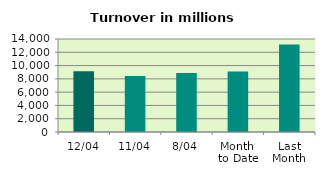
| Category | Series 0 |
|---|---|
| 12/04 | 9132.205 |
| 11/04 | 8417.893 |
| 8/04 | 8900.512 |
| Month 
to Date | 9122.959 |
| Last
Month | 13160.868 |